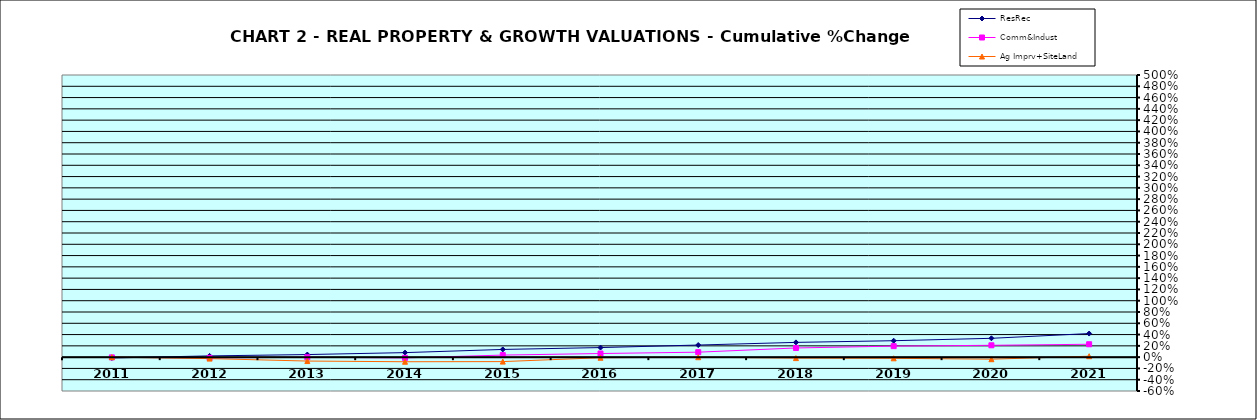
| Category | ResRec | Comm&Indust | Ag Imprv+SiteLand |
|---|---|---|---|
| 2011.0 | -0.014 | -0.004 | 0 |
| 2012.0 | 0.022 | -0.012 | -0.026 |
| 2013.0 | 0.046 | -0.003 | -0.069 |
| 2014.0 | 0.08 | -0.013 | -0.082 |
| 2015.0 | 0.137 | 0.036 | -0.079 |
| 2016.0 | 0.17 | 0.064 | -0.01 |
| 2017.0 | 0.214 | 0.088 | -0.001 |
| 2018.0 | 0.261 | 0.163 | -0.017 |
| 2019.0 | 0.291 | 0.195 | -0.021 |
| 2020.0 | 0.334 | 0.21 | -0.036 |
| 2021.0 | 0.418 | 0.228 | 0.016 |